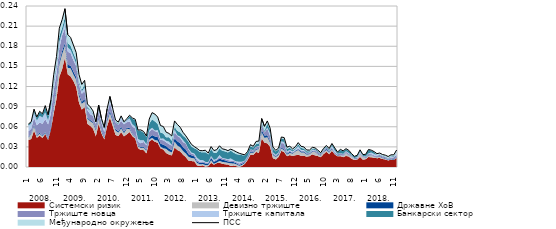
| Category | ПСС |
|---|---|
| 0 | 0.064 |
| 1 | 0.067 |
| 2 | 0.086 |
| 3 | 0.074 |
| 4 | 0.083 |
| 5 | 0.079 |
| 6 | 0.092 |
| 7 | 0.078 |
| 8 | 0.1 |
| 9 | 0.137 |
| 10 | 0.165 |
| 11 | 0.207 |
| 12 | 0.22 |
| 13 | 0.236 |
| 14 | 0.197 |
| 15 | 0.193 |
| 16 | 0.182 |
| 17 | 0.171 |
| 18 | 0.138 |
| 19 | 0.123 |
| 20 | 0.129 |
| 21 | 0.094 |
| 22 | 0.09 |
| 23 | 0.084 |
| 24 | 0.067 |
| 25 | 0.092 |
| 26 | 0.072 |
| 27 | 0.059 |
| 28 | 0.087 |
| 29 | 0.105 |
| 30 | 0.087 |
| 31 | 0.07 |
| 32 | 0.067 |
| 33 | 0.076 |
| 34 | 0.067 |
| 35 | 0.072 |
| 36 | 0.077 |
| 37 | 0.073 |
| 38 | 0.071 |
| 39 | 0.055 |
| 40 | 0.055 |
| 41 | 0.053 |
| 42 | 0.046 |
| 43 | 0.072 |
| 44 | 0.081 |
| 45 | 0.079 |
| 46 | 0.074 |
| 47 | 0.062 |
| 48 | 0.06 |
| 49 | 0.052 |
| 50 | 0.05 |
| 51 | 0.046 |
| 52 | 0.069 |
| 53 | 0.063 |
| 54 | 0.059 |
| 55 | 0.052 |
| 56 | 0.047 |
| 57 | 0.04 |
| 58 | 0.034 |
| 59 | 0.03 |
| 60 | 0.028 |
| 61 | 0.024 |
| 62 | 0.024 |
| 63 | 0.025 |
| 64 | 0.021 |
| 65 | 0.03 |
| 66 | 0.025 |
| 67 | 0.026 |
| 68 | 0.032 |
| 69 | 0.027 |
| 70 | 0.026 |
| 71 | 0.024 |
| 72 | 0.027 |
| 73 | 0.025 |
| 74 | 0.023 |
| 75 | 0.021 |
| 76 | 0.019 |
| 77 | 0.018 |
| 78 | 0.023 |
| 79 | 0.033 |
| 80 | 0.031 |
| 81 | 0.038 |
| 82 | 0.039 |
| 83 | 0.072 |
| 84 | 0.061 |
| 85 | 0.069 |
| 86 | 0.058 |
| 87 | 0.03 |
| 88 | 0.025 |
| 89 | 0.028 |
| 90 | 0.045 |
| 91 | 0.044 |
| 92 | 0.03 |
| 93 | 0.031 |
| 94 | 0.027 |
| 95 | 0.03 |
| 96 | 0.036 |
| 97 | 0.031 |
| 98 | 0.03 |
| 99 | 0.025 |
| 100 | 0.025 |
| 101 | 0.029 |
| 102 | 0.029 |
| 103 | 0.025 |
| 104 | 0.021 |
| 105 | 0.028 |
| 106 | 0.032 |
| 107 | 0.028 |
| 108 | 0.035 |
| 109 | 0.028 |
| 110 | 0.022 |
| 111 | 0.026 |
| 112 | 0.024 |
| 113 | 0.027 |
| 114 | 0.025 |
| 115 | 0.02 |
| 116 | 0.016 |
| 117 | 0.017 |
| 118 | 0.026 |
| 119 | 0.019 |
| 120 | 0.019 |
| 121 | 0.026 |
| 122 | 0.025 |
| 123 | 0.023 |
| 124 | 0.02 |
| 125 | 0.021 |
| 126 | 0.019 |
| 127 | 0.018 |
| 128 | 0.016 |
| 129 | 0.018 |
| 130 | 0.018 |
| 131 | 0.025 |